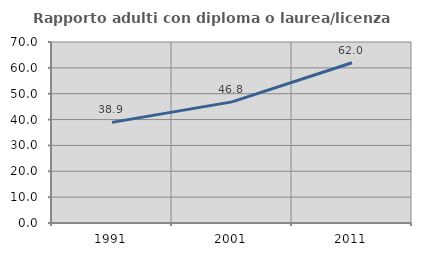
| Category | Rapporto adulti con diploma o laurea/licenza media  |
|---|---|
| 1991.0 | 38.91 |
| 2001.0 | 46.841 |
| 2011.0 | 61.979 |